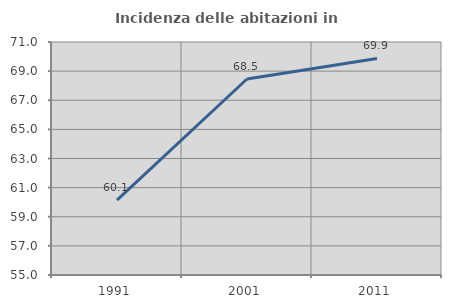
| Category | Incidenza delle abitazioni in proprietà  |
|---|---|
| 1991.0 | 60.147 |
| 2001.0 | 68.458 |
| 2011.0 | 69.871 |